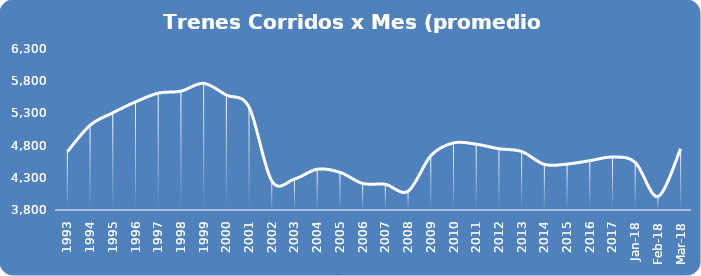
| Category | Series 0 |
|---|---|
| 1993.0 | 4704.75 |
| 1994.0 | 5116.583 |
| 1995.0 | 5308.5 |
| 1996.0 | 5478.833 |
| 1997.0 | 5614.25 |
| 1998.0 | 5645 |
| 1999.0 | 5766.833 |
| 2000.0 | 5584.083 |
| 2001.0 | 5395.583 |
| 2002.0 | 4250.917 |
| 2003.0 | 4280.167 |
| 2004.0 | 4433.333 |
| 2005.0 | 4385.667 |
| 2006.0 | 4211.917 |
| 2007.0 | 4198.583 |
| 2008.0 | 4091.583 |
| 2009.0 | 4643 |
| 2010.0 | 4842.083 |
| 2011.0 | 4821.667 |
| 2012.0 | 4751.333 |
| 2013.0 | 4707.833 |
| 2014.0 | 4507.667 |
| 2015.0 | 4513 |
| 2016.0 | 4565.417 |
| 2017.0 | 4621.833 |
| 43101.0 | 4540 |
| 43132.0 | 4009 |
| 43160.0 | 4751 |